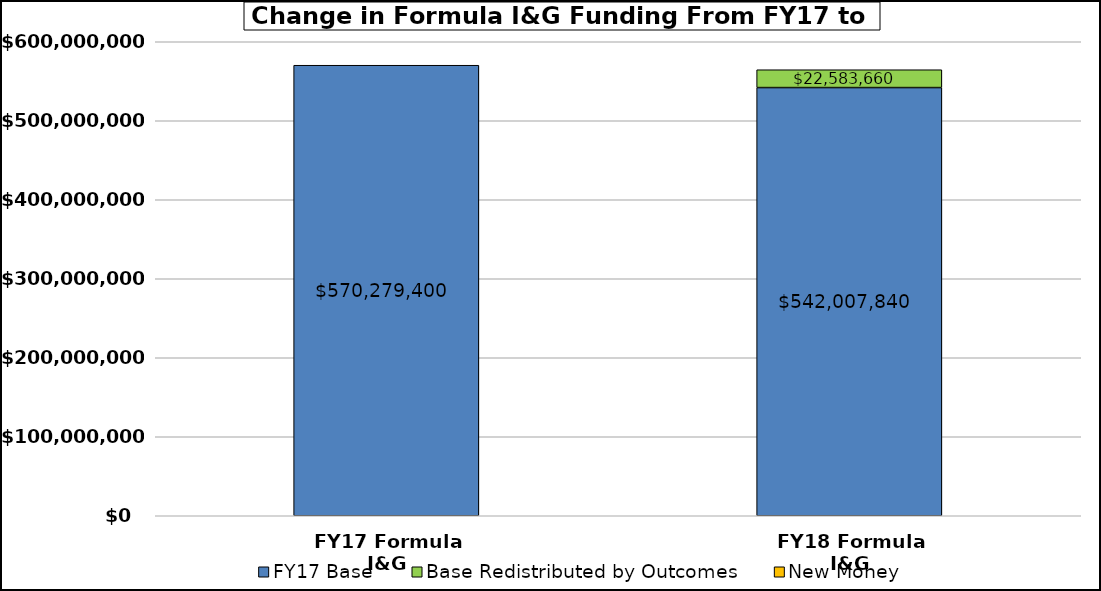
| Category | FY17 Base | Base Redistributed by Outcomes | New Money |
|---|---|---|---|
| FY17 Formula I&G | 570279400 | 0 | 0 |
| FY18 Formula I&G | 542007840 | 22583660 | 0 |